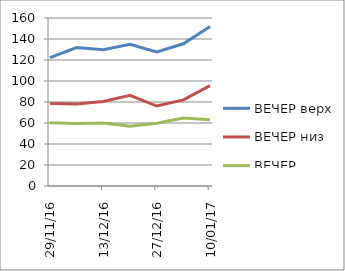
| Category | ВЕЧЕР верх | ВЕЧЕР низ | ВЕЧЕР пульс |
|---|---|---|---|
| 2016-11-29 | 122.286 | 78.571 | 60.286 |
| 2016-12-06 | 131.857 | 78.143 | 59.571 |
| 2016-12-13 | 129.714 | 80.429 | 60 |
| 2016-12-20 | 135 | 86.429 | 57 |
| 2016-12-27 | 127.571 | 76.143 | 59.714 |
| 2017-01-03 | 135.429 | 82 | 64.714 |
| 2017-01-10 | 151.857 | 95.571 | 63 |